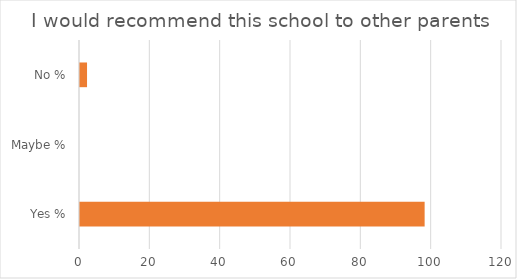
| Category | Series 0 |
|---|---|
| Yes % | 98 |
| Maybe % | 0 |
| No % | 2 |